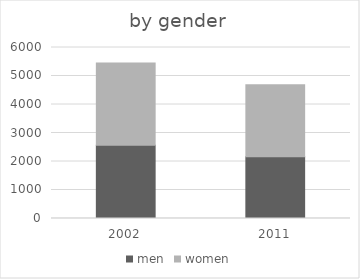
| Category | men | women |
|---|---|---|
| 2002.0 | 2568.2 | 2888.5 |
| 2011.0 | 2166.9 | 2530.1 |